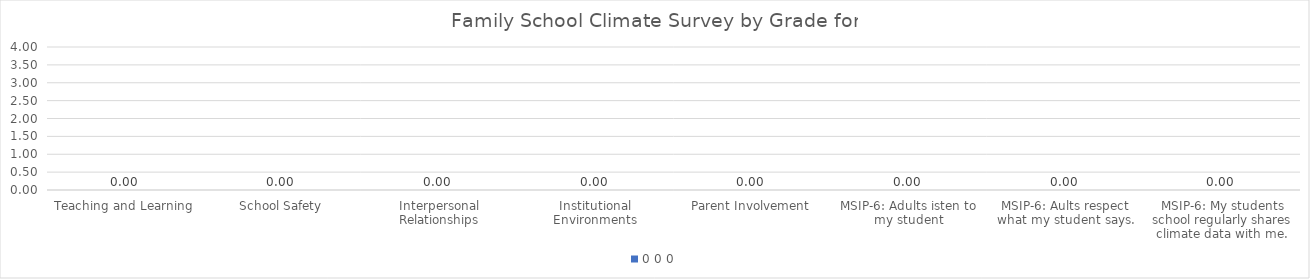
| Category | 0 |
|---|---|
| Teaching and Learning | 0 |
| School Safety | 0 |
| Interpersonal Relationships | 0 |
| Institutional Environments | 0 |
| Parent Involvement | 0 |
| MSIP-6: Adults isten to my student | 0 |
| MSIP-6: Aults respect what my student says. | 0 |
| MSIP-6: My students school regularly shares climate data with me. | 0 |